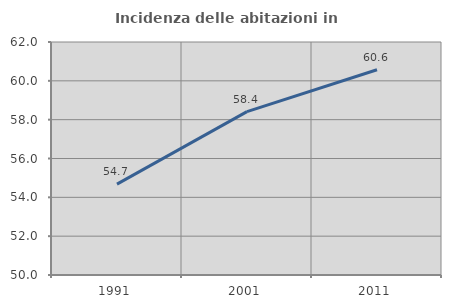
| Category | Incidenza delle abitazioni in proprietà  |
|---|---|
| 1991.0 | 54.682 |
| 2001.0 | 58.416 |
| 2011.0 | 60.572 |